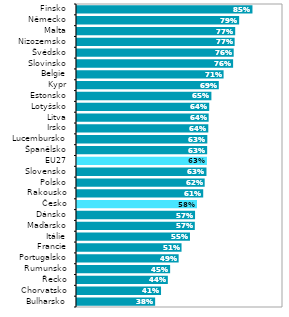
| Category | Series 1 |
|---|---|
| Bulharsko | 0.379 |
| Chorvatsko | 0.408 |
| Řecko | 0.441 |
| Rumunsko | 0.452 |
| Portugalsko | 0.493 |
| Francie | 0.507 |
| Itálie | 0.548 |
| Maďarsko | 0.572 |
| Dánsko | 0.573 |
| Česko | 0.582 |
| Rakousko | 0.613 |
| Polsko | 0.62 |
| Slovensko | 0.629 |
| EU27 | 0.631 |
| Španělsko | 0.632 |
| Lucembursko | 0.633 |
| Irsko | 0.637 |
| Litva | 0.639 |
| Lotyšsko | 0.642 |
| Estonsko | 0.652 |
| Kypr | 0.688 |
| Belgie | 0.712 |
| Slovinsko | 0.758 |
| Švédsko | 0.761 |
| Nizozemsko | 0.765 |
| Malta | 0.768 |
| Německo | 0.787 |
| Finsko | 0.852 |